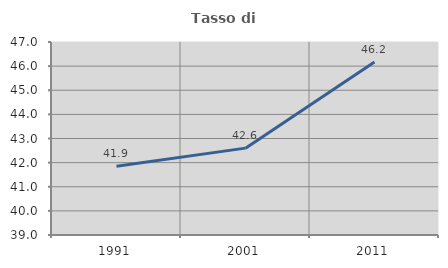
| Category | Tasso di occupazione   |
|---|---|
| 1991.0 | 41.852 |
| 2001.0 | 42.601 |
| 2011.0 | 46.173 |